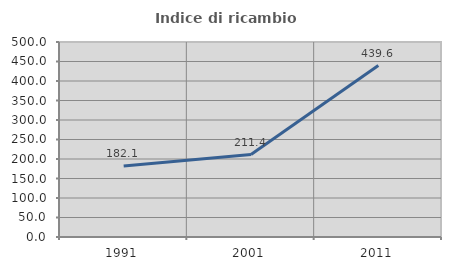
| Category | Indice di ricambio occupazionale  |
|---|---|
| 1991.0 | 182.051 |
| 2001.0 | 211.364 |
| 2011.0 | 439.623 |